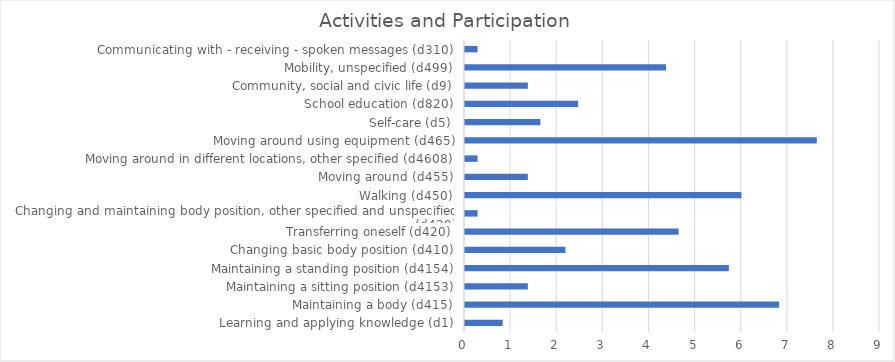
| Category | Series 0 |
|---|---|
| Learning and applying knowledge (d1) | 0.817 |
| Maintaining a body (d415) | 6.812 |
| Maintaining a sitting position (d4153) | 1.362 |
| Maintaining a standing position (d4154) | 5.722 |
| Changing basic body position (d410) | 2.18 |
| Transferring oneself (d420) | 4.632 |
| Changing and maintaining body position, other specified and unspecified (d429) | 0.272 |
| Walking (d450) | 5.995 |
| Moving around (d455) | 1.362 |
| Moving around in different locations, other specified (d4608) | 0.272 |
| Moving around using equipment (d465) | 7.629 |
| Self-care (d5) | 1.635 |
| School education (d820) | 2.452 |
| Community, social and civic life (d9) | 1.362 |
| Mobility, unspecified (d499) | 4.36 |
| Communicating with - receiving - spoken messages (d310) | 0.272 |